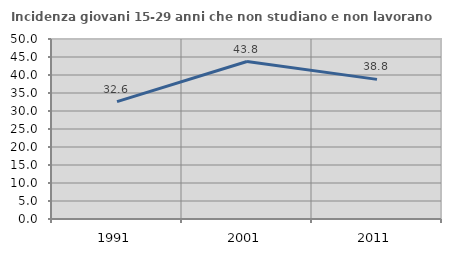
| Category | Incidenza giovani 15-29 anni che non studiano e non lavorano  |
|---|---|
| 1991.0 | 32.609 |
| 2001.0 | 43.75 |
| 2011.0 | 38.788 |